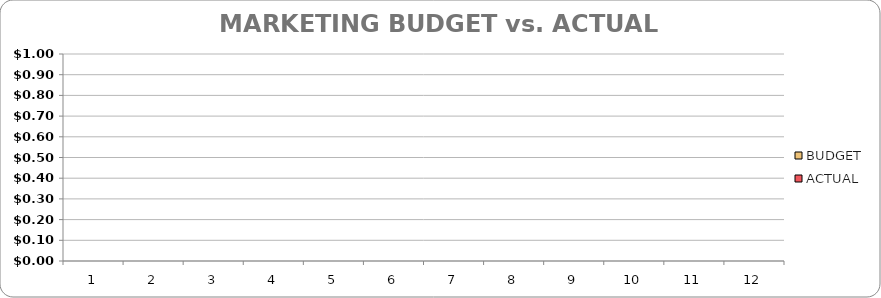
| Category | BUDGET | ACTUAL |
|---|---|---|
| 0 | 0 | 0 |
| 1 | 0 | 0 |
| 2 | 0 | 0 |
| 3 | 0 | 0 |
| 4 | 0 | 0 |
| 5 | 0 | 0 |
| 6 | 0 | 0 |
| 7 | 0 | 0 |
| 8 | 0 | 0 |
| 9 | 0 | 0 |
| 10 | 0 | 0 |
| 11 | 0 | 0 |